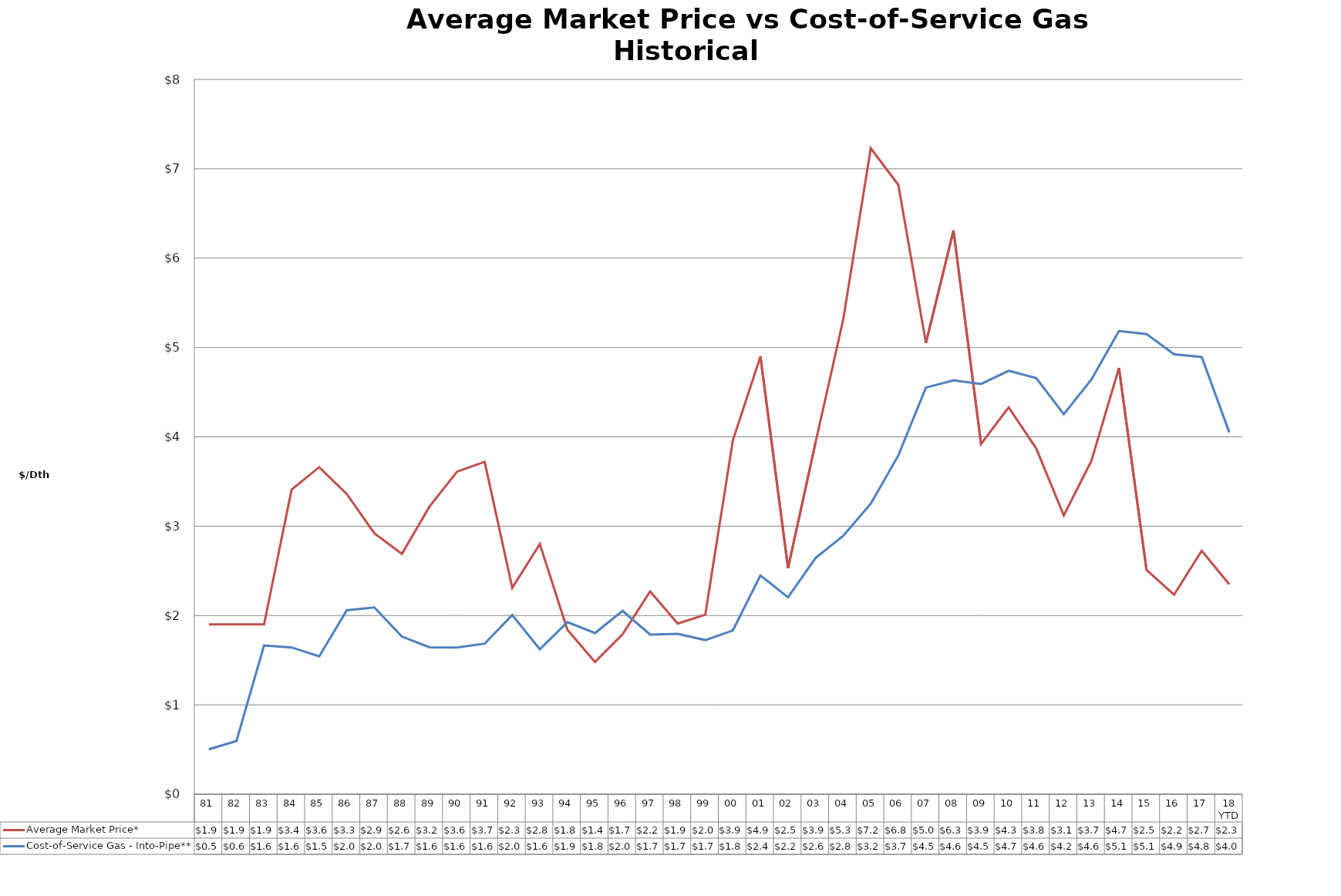
| Category | Average Market Price* | Cost-of-Service Gas - Into-Pipe** |
|---|---|---|
| 81 | 1.9 | 0.502 |
| 82 | 1.9 | 0.596 |
| 83 | 1.9 | 1.665 |
| 84 | 3.41 | 1.643 |
| 85 | 3.66 | 1.543 |
| 86 | 3.36 | 2.059 |
| 87 | 2.92 | 2.091 |
| 88 | 2.69 | 1.764 |
| 89 | 3.22 | 1.644 |
| 90 | 3.61 | 1.642 |
| 91 | 3.72 | 1.685 |
| 92 | 2.31 | 2.005 |
| 93 | 2.8 | 1.623 |
| 94 | 1.84 | 1.926 |
| 95 | 1.48 | 1.804 |
| 96 | 1.79 | 2.052 |
| 97 | 2.27 | 1.787 |
| 98 | 1.91 | 1.795 |
| 99 | 2.01 | 1.725 |
| 00 | 3.96 | 1.833 |
| 01 | 4.9 | 2.448 |
| 02 | 2.53 | 2.204 |
| 03 | 3.94 | 2.644 |
| 04 | 5.31 | 2.891 |
| 05 | 7.23 | 3.251 |
| 06 | 6.82 | 3.792 |
| 07 | 5.05 | 4.551 |
| 08 | 6.31 | 4.632 |
| 09 | 3.92 | 4.592 |
| 10 | 4.33 | 4.74 |
| 11 | 3.87 | 4.658 |
| 12 | 3.12 | 4.253 |
| 13 | 3.73 | 4.641 |
| 14 | 4.77 | 5.184 |
| 15 | 2.51 | 5.151 |
| 16 | 2.233 | 4.923 |
| 17 | 2.725 | 4.894 |
| 18 YTD | 2.349 | 4.051 |